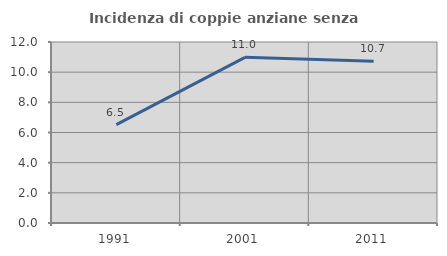
| Category | Incidenza di coppie anziane senza figli  |
|---|---|
| 1991.0 | 6.527 |
| 2001.0 | 10.983 |
| 2011.0 | 10.72 |